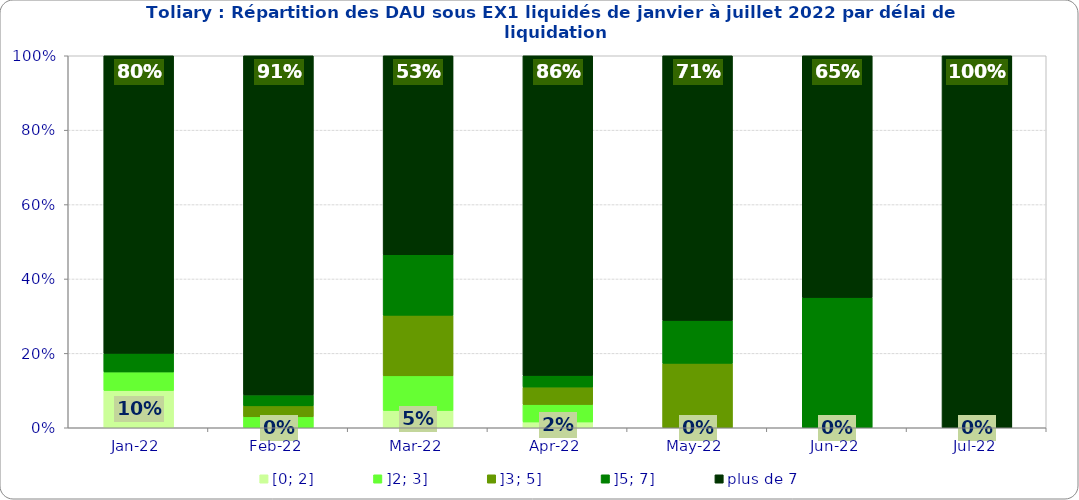
| Category | [0; 2] | ]2; 3] | ]3; 5] | ]5; 7] | plus de 7 |
|---|---|---|---|---|---|
| 2022-01-01 | 0.1 | 0.05 | 0 | 0.05 | 0.8 |
| 2022-02-01 | 0 | 0.029 | 0.029 | 0.029 | 0.912 |
| 2022-03-01 | 0.047 | 0.093 | 0.163 | 0.163 | 0.535 |
| 2022-04-01 | 0.016 | 0.047 | 0.047 | 0.031 | 0.859 |
| 2022-05-01 | 0 | 0 | 0.173 | 0.115 | 0.712 |
| 2022-06-01 | 0 | 0 | 0 | 0.35 | 0.65 |
| 2022-07-01 | 0 | 0 | 0 | 0 | 1 |